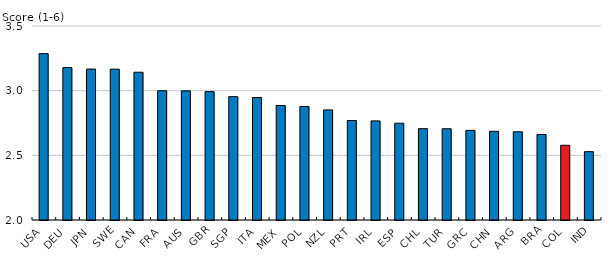
| Category | Average Management Score |
|---|---|
| USA | 3.286 |
| DEU | 3.178 |
| JPN | 3.167 |
| SWE | 3.166 |
| CAN | 3.143 |
| FRA | 2.999 |
| AUS | 2.999 |
| GBR | 2.993 |
| SGP | 2.954 |
| ITA | 2.947 |
| MEX | 2.885 |
| POL | 2.878 |
| NZL | 2.851 |
| PRT | 2.769 |
| IRL | 2.766 |
| ESP | 2.748 |
| CHL | 2.706 |
| TUR | 2.706 |
| GRC | 2.693 |
| CHN | 2.686 |
| ARG | 2.682 |
| BRA | 2.661 |
| COL | 2.578 |
| IND | 2.528 |